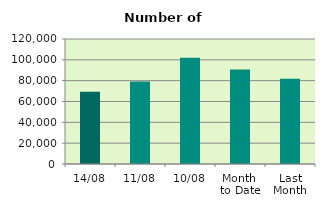
| Category | Series 0 |
|---|---|
| 14/08 | 69316 |
| 11/08 | 79306 |
| 10/08 | 102000 |
| Month 
to Date | 90627.2 |
| Last
Month | 81818 |